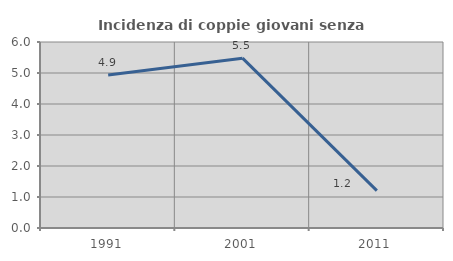
| Category | Incidenza di coppie giovani senza figli |
|---|---|
| 1991.0 | 4.938 |
| 2001.0 | 5.479 |
| 2011.0 | 1.205 |